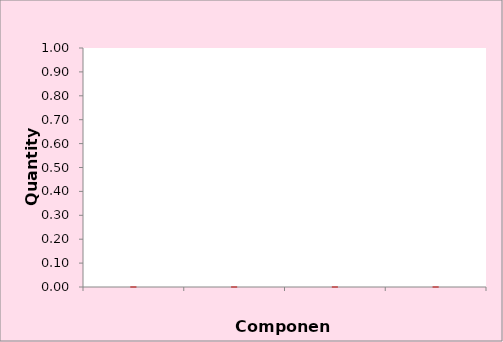
| Category | Series 0 | Series 1 |
|---|---|---|
| 0 | 0 | 0 |
| 1 | 0 | 0 |
| 2 | 0 | 0 |
| 3 | 0 | 0 |